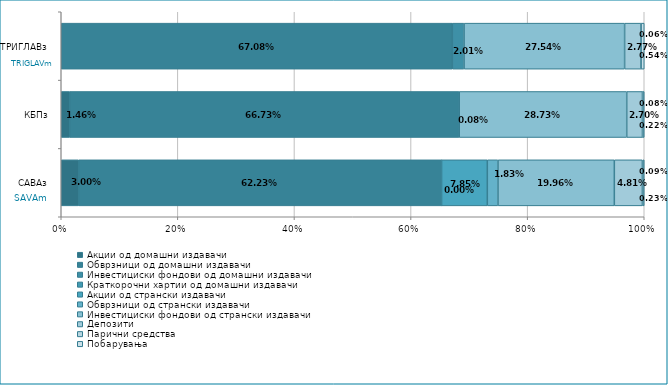
| Category | Акции од домашни издавачи  | Обврзници од домашни издавачи  | Инвестициски фондови од домашни издавачи  | Краткорочни хартии од домашни издавачи  | Акции од странски издавачи  | Обврзници од странски издавачи  | Инвестициски фондови од странски издавaчи | Депозити  | Парични средства  | Побарувања |
|---|---|---|---|---|---|---|---|---|---|---|
| САВАз | 0.03 | 0.622 | 0 | 0 | 0.078 | 0.018 | 0.2 | 0.048 | 0.001 | 0.002 |
| КБПз | 0.015 | 0.667 | 0.001 | 0 | 0 | 0 | 0.287 | 0.027 | 0.001 | 0.002 |
| ТРИГЛАВз | 0 | 0.671 | 0.02 | 0 | 0 | 0 | 0.275 | 0.028 | 0.001 | 0.005 |